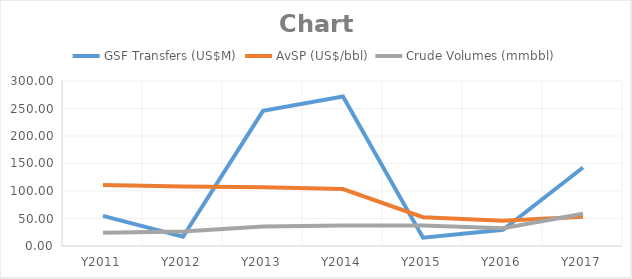
| Category | GSF Transfers (US$M) | AvSP (US$/bbl) | Crude Volumes (mmbbl) |
|---|---|---|---|
| Y2011 | 54.81 | 111.08 | 24.2 |
| Y2012 | 16.88 | 108 | 26.4 |
| Y2013 | 245.73 | 106.75 | 35.6 |
| Y2014 | 271.76 | 103.504 | 37.2 |
| Y2015 | 15.17 | 52.36 | 37.4 |
| Y2016 | 29.51 | 46.13 | 32.3 |
| Y2017 | 142.68 | 53.16 | 58.7 |